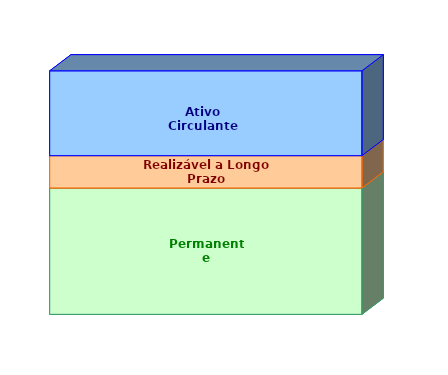
| Category | Permanente | Realizável a Longo Prazo | Ativo Circulante |
|---|---|---|---|
| 0 | 0.519 | 0.133 | 0.348 |